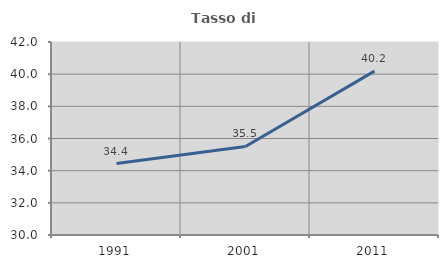
| Category | Tasso di occupazione   |
|---|---|
| 1991.0 | 34.444 |
| 2001.0 | 35.505 |
| 2011.0 | 40.189 |